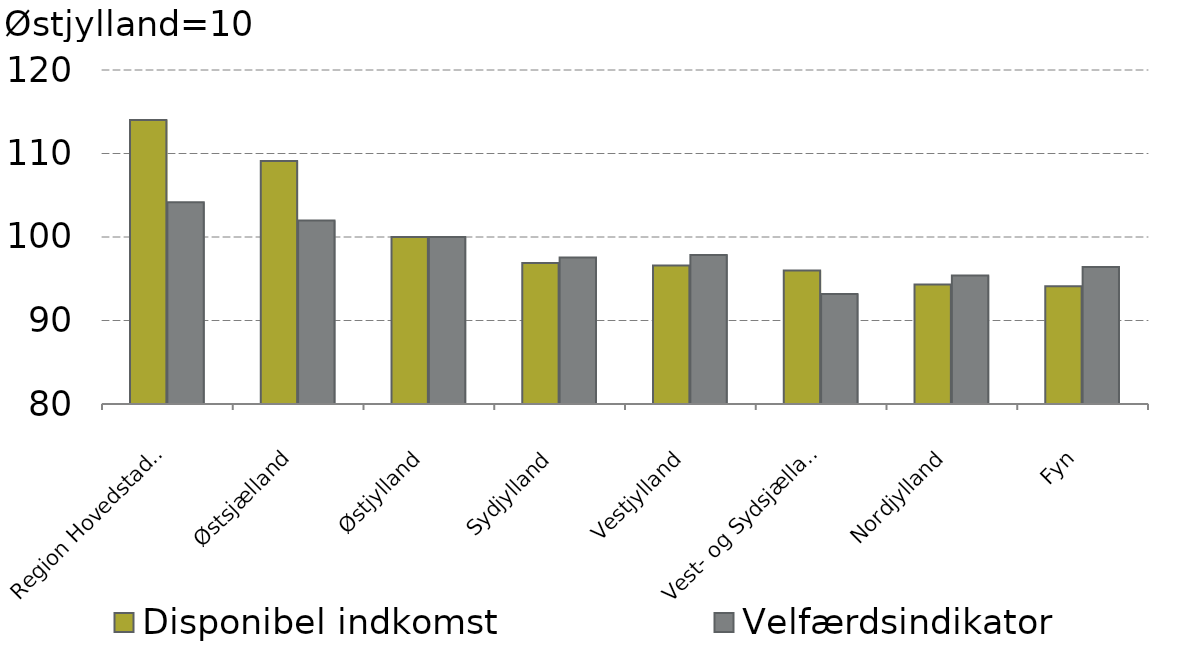
| Category |  Disponibel indkomst |  Velfærdsindikator |
|---|---|---|
| Region Hovedstaden | 114 | 104.175 |
| Østsjælland | 109.1 | 101.989 |
| Østjylland | 100 | 100 |
| Sydjylland | 96.9 | 97.535 |
| Vestjylland | 96.6 | 97.848 |
| Vest- og Sydsjælland | 96 | 93.163 |
| Nordjylland | 94.3 | 95.381 |
| Fyn | 94.1 | 96.416 |